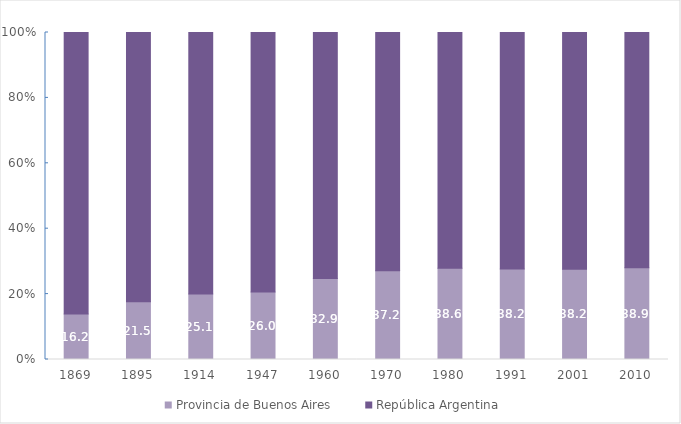
| Category | Provincia de Buenos Aires | República Argentina |
|---|---|---|
| 1869.0 | 16.154 | 100 |
| 1895.0 | 21.494 | 100 |
| 1914.0 | 25.07 | 100 |
| 1947.0 | 25.974 | 100 |
| 1960.0 | 32.868 | 100 |
| 1970.0 | 37.238 | 100 |
| 1980.0 | 38.637 | 100 |
| 1991.0 | 38.242 | 100 |
| 2001.0 | 38.177 | 100 |
| 2010.0 | 38.947 | 100 |